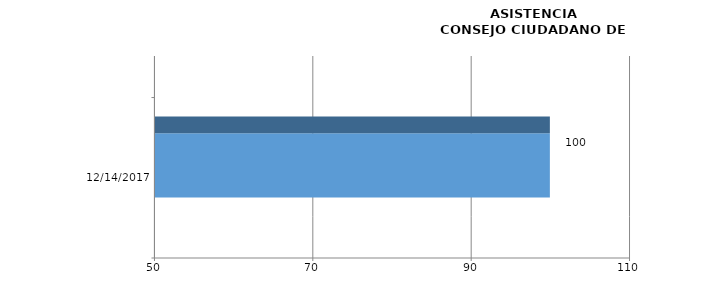
| Category | Series 0 |
|---|---|
| 12/14/17 | 100 |